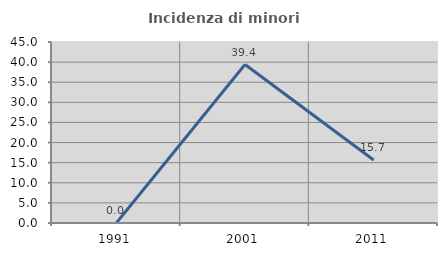
| Category | Incidenza di minori stranieri |
|---|---|
| 1991.0 | 0 |
| 2001.0 | 39.394 |
| 2011.0 | 15.672 |